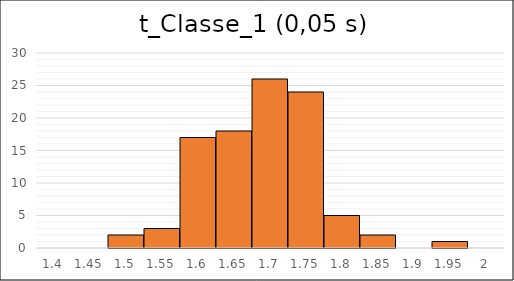
| Category | Series 1 |
|---|---|
| 1.4 | 0 |
| 1.45 | 0 |
| 1.5 | 2 |
| 1.55 | 3 |
| 1.6 | 17 |
| 1.65 | 18 |
| 1.7 | 26 |
| 1.75 | 24 |
| 1.8 | 5 |
| 1.85 | 2 |
| 1.9 | 0 |
| 1.95 | 1 |
| 2.0 | 0 |